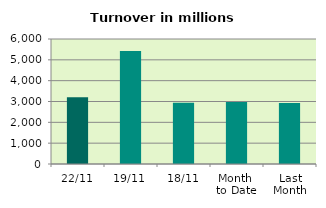
| Category | Series 0 |
|---|---|
| 22/11 | 3206.763 |
| 19/11 | 5426.162 |
| 18/11 | 2941.361 |
| Month 
to Date | 2977.322 |
| Last
Month | 2924.951 |